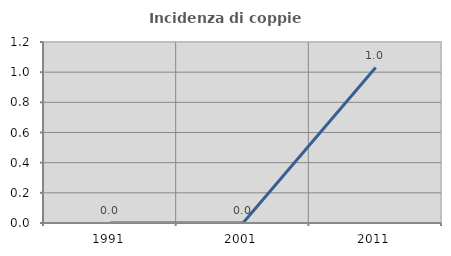
| Category | Incidenza di coppie miste |
|---|---|
| 1991.0 | 0 |
| 2001.0 | 0 |
| 2011.0 | 1.031 |